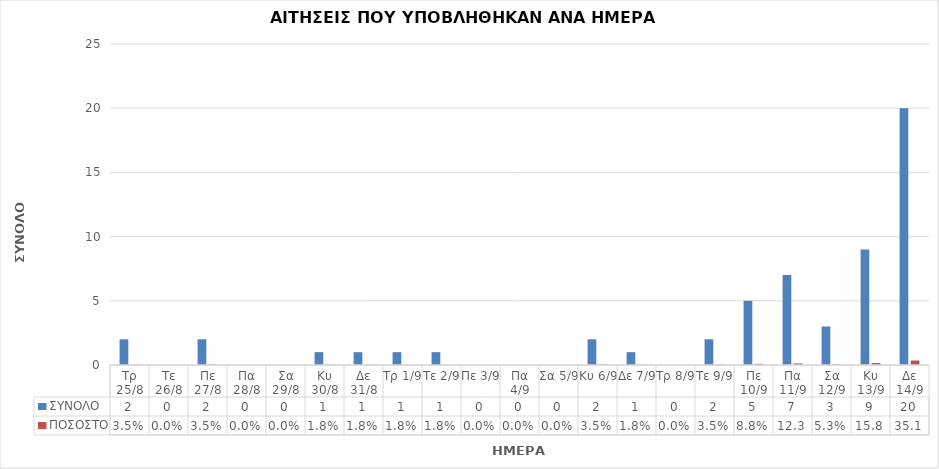
| Category | ΣΥΝΟΛΟ | ΠΟΣΟΣΤΟ |
|---|---|---|
| Τρ 25/8 | 2 | 0.035 |
| Τε 26/8 | 0 | 0 |
| Πε 27/8 | 2 | 0.035 |
| Πα 28/8 | 0 | 0 |
| Σα 29/8 | 0 | 0 |
| Κυ 30/8 | 1 | 0.018 |
| Δε 31/8 | 1 | 0.018 |
| Τρ 1/9 | 1 | 0.018 |
| Τε 2/9 | 1 | 0.018 |
| Πε 3/9 | 0 | 0 |
| Πα 4/9 | 0 | 0 |
| Σα 5/9 | 0 | 0 |
| Κυ 6/9 | 2 | 0.035 |
| Δε 7/9 | 1 | 0.018 |
| Τρ 8/9 | 0 | 0 |
| Τε 9/9 | 2 | 0.035 |
| Πε 10/9 | 5 | 0.088 |
| Πα 11/9 | 7 | 0.123 |
| Σα 12/9 | 3 | 0.053 |
| Κυ 13/9 | 9 | 0.158 |
| Δε 14/9 | 20 | 0.351 |